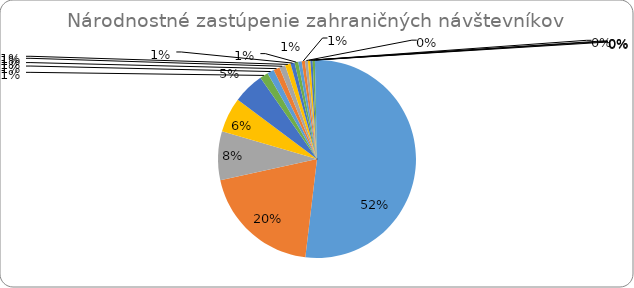
| Category | Series 0 |
|---|---|
| Česko | 47917 |
| Poľsko | 18189 |
| Maďarsko | 7348 |
| Nemecko | 5269 |
| Ukrajina | 4695 |
| Veľká Británia | 1259 |
| Rakúsko | 1035 |
| Litva | 935 |
| Rumunsko | 905 |
| Rusko | 833 |
| Slovinsko | 614 |
| Estónsko | 554 |
| Lotyšsko | 528 |
| Taliansko | 482 |
| Holandsko | 437 |
| Francúzsko | 375 |
| Švajčiarsko | 342 |
| Belgicko | 335 |
| USA | 312 |